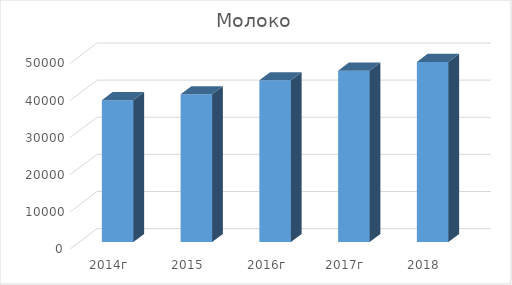
| Category | Молоко |
|---|---|
| 2014г | 38216 |
| 2015 | 39794 |
| 2016г | 43573 |
| 2017г | 46180 |
| 2018 | 48500 |